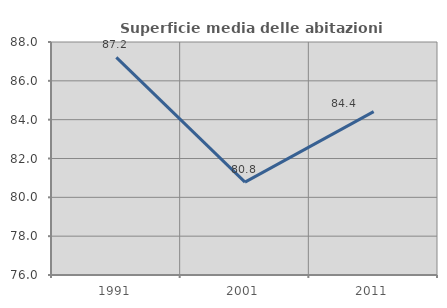
| Category | Superficie media delle abitazioni occupate |
|---|---|
| 1991.0 | 87.204 |
| 2001.0 | 80.784 |
| 2011.0 | 84.414 |